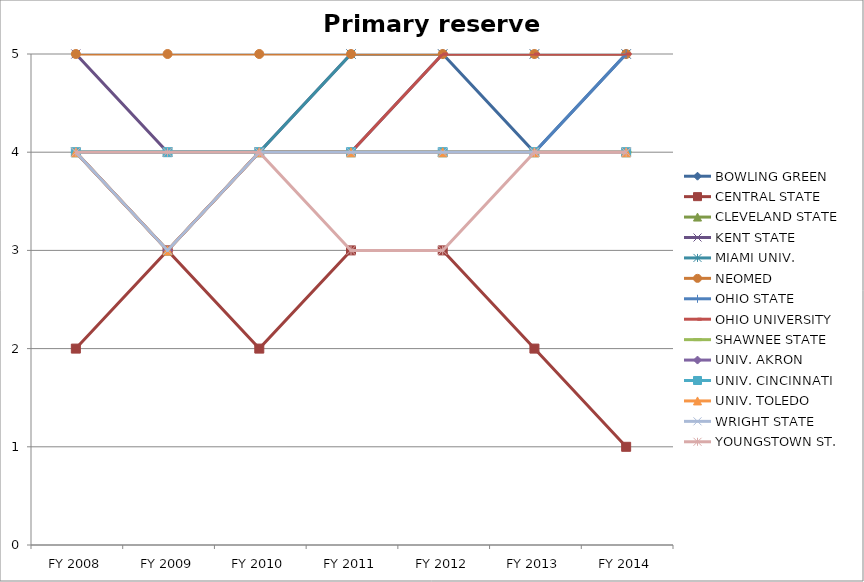
| Category | BOWLING GREEN  | CENTRAL STATE  | CLEVELAND STATE  | KENT STATE  | MIAMI UNIV.  | NEOMED  | OHIO STATE  | OHIO UNIVERSITY  | SHAWNEE STATE  | UNIV. AKRON  | UNIV. CINCINNATI  | UNIV. TOLEDO  | WRIGHT STATE  | YOUNGSTOWN ST.  |
|---|---|---|---|---|---|---|---|---|---|---|---|---|---|---|
| FY 2014 | 5 | 1 | 4 | 5 | 5 | 5 | 5 | 5 | 4 | 4 | 4 | 4 | 4 | 4 |
| FY 2013 | 4 | 2 | 4 | 5 | 5 | 5 | 4 | 5 | 4 | 4 | 4 | 4 | 4 | 4 |
| FY 2012 | 5 | 3 | 4 | 5 | 5 | 5 | 4 | 5 | 4 | 4 | 4 | 4 | 4 | 3 |
| FY 2011 | 4 | 3 | 4 | 5 | 5 | 5 | 4 | 4 | 4 | 4 | 4 | 4 | 4 | 3 |
| FY 2010 | 4 | 2 | 4 | 4 | 4 | 5 | 4 | 4 | 4 | 4 | 4 | 4 | 4 | 4 |
| FY 2009 | 4 | 3 | 3 | 4 | 4 | 5 | 4 | 3 | 4 | 3 | 4 | 3 | 3 | 4 |
| FY 2008 | 4 | 2 | 4 | 5 | 4 | 5 | 4 | 4 | 4 | 4 | 4 | 4 | 4 | 4 |